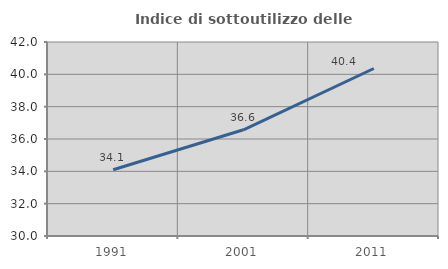
| Category | Indice di sottoutilizzo delle abitazioni  |
|---|---|
| 1991.0 | 34.095 |
| 2001.0 | 36.57 |
| 2011.0 | 40.361 |